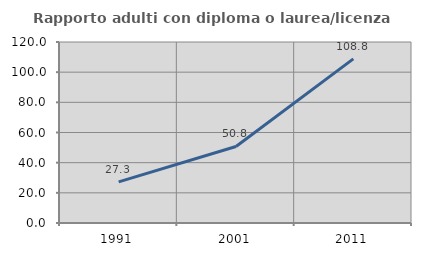
| Category | Rapporto adulti con diploma o laurea/licenza media  |
|---|---|
| 1991.0 | 27.306 |
| 2001.0 | 50.754 |
| 2011.0 | 108.784 |